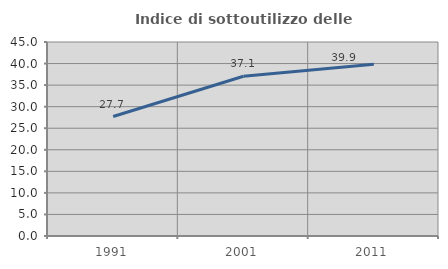
| Category | Indice di sottoutilizzo delle abitazioni  |
|---|---|
| 1991.0 | 27.709 |
| 2001.0 | 37.055 |
| 2011.0 | 39.866 |